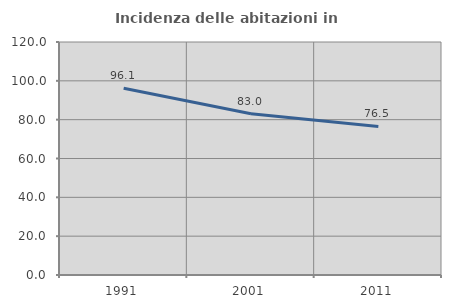
| Category | Incidenza delle abitazioni in proprietà  |
|---|---|
| 1991.0 | 96.135 |
| 2001.0 | 83 |
| 2011.0 | 76.531 |